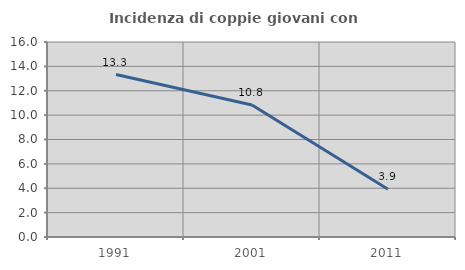
| Category | Incidenza di coppie giovani con figli |
|---|---|
| 1991.0 | 13.333 |
| 2001.0 | 10.825 |
| 2011.0 | 3.922 |